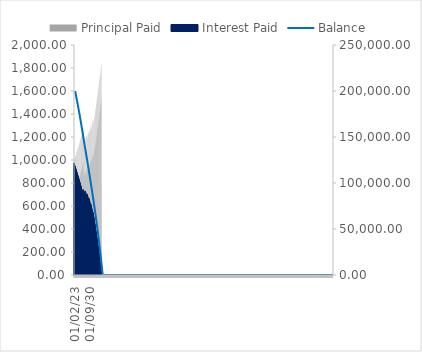
| Category | Principal Paid | Interest Paid |
|---|---|---|
| 01/02/23 | 997.078 | 973.51 |
| 01/03/23 | 701.931 | 968.657 |
| 01/04/23 | 1005.348 | 965.24 |
| 01/05/23 | 710.242 | 960.347 |
| 01/06/23 | 1013.699 | 956.889 |
| 01/07/23 | 718.633 | 951.955 |
| 01/08/23 | 1022.131 | 948.457 |
| 01/09/23 | 727.106 | 943.482 |
| 01/10/23 | 1030.646 | 939.943 |
| 01/11/23 | 735.662 | 934.926 |
| 01/12/23 | 1039.243 | 931.345 |
| 01/01/24 | 744.302 | 926.287 |
| 01/02/24 | 1047.925 | 922.664 |
| 01/03/24 | 753.025 | 917.563 |
| 01/04/24 | 1056.691 | 913.897 |
| 01/05/24 | 761.834 | 908.754 |
| 01/06/24 | 1065.543 | 905.046 |
| 01/07/24 | 770.729 | 899.859 |
| 01/08/24 | 1074.481 | 896.107 |
| 01/09/24 | 779.711 | 890.877 |
| 01/10/24 | 1083.506 | 887.082 |
| 01/11/24 | 788.78 | 881.808 |
| 01/12/24 | 1092.62 | 877.969 |
| 01/01/25 | 797.938 | 872.65 |
| 01/02/25 | 1101.822 | 868.766 |
| 01/03/25 | 807.185 | 863.403 |
| 01/04/25 | 1111.114 | 859.474 |
| 01/05/25 | 816.523 | 854.066 |
| 01/06/25 | 1120.497 | 850.091 |
| 01/07/25 | 825.951 | 844.637 |
| 01/08/25 | 1129.971 | 840.617 |
| 01/09/25 | 835.472 | 835.117 |
| 01/10/25 | 1139.538 | 831.05 |
| 01/11/25 | 845.085 | 825.503 |
| 01/12/25 | 1149.199 | 821.39 |
| 01/01/26 | 854.792 | 815.796 |
| 01/02/26 | 1158.953 | 811.635 |
| 01/03/26 | 864.594 | 805.994 |
| 01/04/26 | 1168.803 | 801.785 |
| 01/05/26 | 874.492 | 796.096 |
| 01/06/26 | 1178.749 | 791.84 |
| 01/07/26 | 884.486 | 786.102 |
| 01/08/26 | 1188.792 | 781.797 |
| 01/09/26 | 894.578 | 776.01 |
| 01/10/26 | 1198.932 | 771.656 |
| 01/11/26 | 904.768 | 765.82 |
| 01/12/26 | 1209.172 | 761.416 |
| 01/01/27 | 915.058 | 755.53 |
| 01/02/27 | 1219.512 | 751.076 |
| 01/03/27 | 925.448 | 745.14 |
| 01/04/27 | 1229.953 | 740.635 |
| 01/05/27 | 935.94 | 734.648 |
| 01/06/27 | 1240.495 | 730.093 |
| 01/07/27 | 946.534 | 724.055 |
| 01/08/27 | 1251.141 | 719.447 |
| 01/09/27 | 957.231 | 713.357 |
| 01/10/27 | 1261.89 | 708.698 |
| 01/11/27 | 968.033 | 702.556 |
| 01/12/27 | 1272.745 | 697.844 |
| 01/01/28 | 978.94 | 691.649 |
| 01/02/28 | 1146.507 | 742.503 |
| 01/03/28 | 852.54 | 736.47 |
| 01/04/28 | 1157.025 | 731.985 |
| 01/05/28 | 863.113 | 725.897 |
| 01/06/28 | 1167.655 | 721.355 |
| 01/07/28 | 873.799 | 715.211 |
| 01/08/28 | 1178.396 | 710.614 |
| 01/09/28 | 884.597 | 704.413 |
| 01/10/28 | 1189.251 | 699.759 |
| 01/11/28 | 895.509 | 693.501 |
| 01/12/28 | 1200.22 | 688.79 |
| 01/01/29 | 906.536 | 682.474 |
| 01/02/29 | 1168.56 | 728.252 |
| 01/03/29 | 875.167 | 721.645 |
| 01/04/29 | 1180.115 | 716.696 |
| 01/05/29 | 886.788 | 710.024 |
| 01/06/29 | 1191.802 | 705.01 |
| 01/07/29 | 898.541 | 698.271 |
| 01/08/29 | 1203.621 | 693.191 |
| 01/09/29 | 910.427 | 686.385 |
| 01/10/29 | 1215.574 | 681.238 |
| 01/11/29 | 922.447 | 674.365 |
| 01/12/29 | 1227.663 | 669.149 |
| 01/01/30 | 934.604 | 662.208 |
| 01/02/30 | 1196.42 | 702.325 |
| 01/03/30 | 903.652 | 695.093 |
| 01/04/30 | 1209.115 | 689.63 |
| 01/05/30 | 916.424 | 682.321 |
| 01/06/30 | 1221.963 | 676.782 |
| 01/07/30 | 929.35 | 669.395 |
| 01/08/30 | 1234.968 | 663.777 |
| 01/09/30 | 942.433 | 656.312 |
| 01/10/30 | 1248.13 | 650.615 |
| 01/11/30 | 955.675 | 643.07 |
| 01/12/30 | 1261.452 | 637.293 |
| 01/01/31 | 969.077 | 629.668 |
| 01/02/31 | 1230.151 | 663.964 |
| 01/03/31 | 938.066 | 656.049 |
| 01/04/31 | 1244.101 | 650.014 |
| 01/05/31 | 952.106 | 642.009 |
| 01/06/31 | 1258.232 | 635.883 |
| 01/07/31 | 966.327 | 627.788 |
| 01/08/31 | 1272.545 | 621.571 |
| 01/09/31 | 980.732 | 613.383 |
| 01/10/31 | 1287.042 | 607.073 |
| 01/11/31 | 995.323 | 598.792 |
| 01/12/31 | 1301.727 | 592.388 |
| 01/01/32 | 1010.102 | 584.013 |
| 01/02/32 | 1269.634 | 612.292 |
| 01/03/32 | 978.294 | 603.631 |
| 01/04/32 | 1284.968 | 596.958 |
| 01/05/32 | 993.733 | 588.192 |
| 01/06/32 | 1300.512 | 581.414 |
| 01/07/32 | 1009.383 | 572.542 |
| 01/08/32 | 1316.269 | 565.657 |
| 01/09/32 | 1025.248 | 556.678 |
| 01/10/32 | 1332.241 | 549.684 |
| 01/11/32 | 1041.329 | 540.596 |
| 01/12/32 | 1348.433 | 533.493 |
| 01/01/33 | 1057.631 | 524.295 |
| 01/02/33 | 1314.3 | 546.326 |
| 01/03/33 | 1023.773 | 536.854 |
| 01/04/33 | 1331.151 | 529.475 |
| 01/05/33 | 1040.746 | 519.881 |
| 01/06/33 | 1348.247 | 512.38 |
| 01/07/33 | 1057.964 | 502.663 |
| 01/08/33 | 1365.589 | 495.038 |
| 01/09/33 | 1075.431 | 485.196 |
| 01/10/33 | 1383.182 | 477.445 |
| 01/11/33 | 1093.151 | 467.476 |
| 01/12/33 | 1401.03 | 459.597 |
| 01/01/34 | 1111.127 | 449.499 |
| 01/02/34 | 1419.136 | 441.491 |
| 01/03/34 | 1129.364 | 431.263 |
| 01/04/34 | 1437.504 | 423.123 |
| 01/05/34 | 1147.864 | 412.762 |
| 01/06/34 | 1456.137 | 404.489 |
| 01/07/34 | 1166.632 | 393.995 |
| 01/08/34 | 1475.04 | 385.586 |
| 01/09/34 | 1185.671 | 374.955 |
| 01/10/34 | 1494.217 | 366.41 |
| 01/11/34 | 1204.986 | 355.64 |
| 01/12/34 | 1513.671 | 346.956 |
| 01/01/35 | 1224.58 | 336.046 |
| 01/02/35 | 1533.406 | 327.22 |
| 01/03/35 | 1244.458 | 316.168 |
| 01/04/35 | 1553.427 | 307.199 |
| 01/05/35 | 1264.623 | 296.003 |
| 01/06/35 | 1573.738 | 286.889 |
| 01/07/35 | 1285.08 | 275.546 |
| 01/08/35 | 1594.342 | 266.284 |
| 01/09/35 | 1305.833 | 254.793 |
| 01/10/35 | 1615.245 | 245.382 |
| 01/11/35 | 1326.887 | 233.74 |
| 01/12/35 | 1636.45 | 224.177 |
| 01/01/36 | 1348.244 | 212.382 |
| 01/02/36 | 1657.961 | 202.665 |
| 01/03/36 | 1369.911 | 190.716 |
| 01/04/36 | 1679.784 | 180.842 |
| 01/05/36 | 1391.891 | 168.736 |
| 01/06/36 | 1701.923 | 158.704 |
| 01/07/36 | 1414.189 | 146.437 |
| 01/08/36 | 1724.382 | 136.245 |
| 01/09/36 | 1436.81 | 123.817 |
| 01/10/36 | 1747.165 | 113.461 |
| 01/11/36 | 1459.758 | 100.869 |
| 01/12/36 | 1770.279 | 90.348 |
| 01/01/37 | 1483.038 | 77.589 |
| 01/02/37 | 1793.726 | 66.9 |
| 01/03/37 | 1506.654 | 53.972 |
| 01/04/37 | 1817.513 | 43.113 |
| 01/05/37 | 1530.613 | 30.014 |
| 01/06/37 | 1841.644 | 18.982 |
| 01/07/37 | 792.096 | 5.709 |